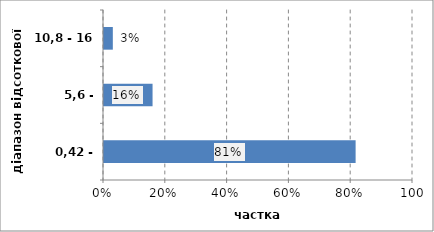
| Category | Series 0 |
|---|---|
| 0,42 - 5,6 | 0.814 |
| 5,6 - 10,8 | 0.157 |
| 10,8 - 16 | 0.029 |